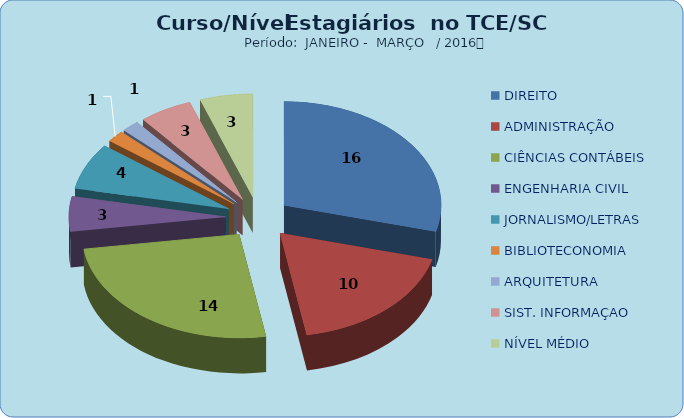
| Category | Series 0 |
|---|---|
| DIREITO | 16 |
| ADMINISTRAÇÃO | 10 |
| CIÊNCIAS CONTÁBEIS | 14 |
| ENGENHARIA CIVIL | 3 |
| JORNALISMO/LETRAS | 4 |
| BIBLIOTECONOMIA | 1 |
| ARQUITETURA | 1 |
| SIST. INFORMAÇAO | 3 |
| NÍVEL MÉDIO | 3 |